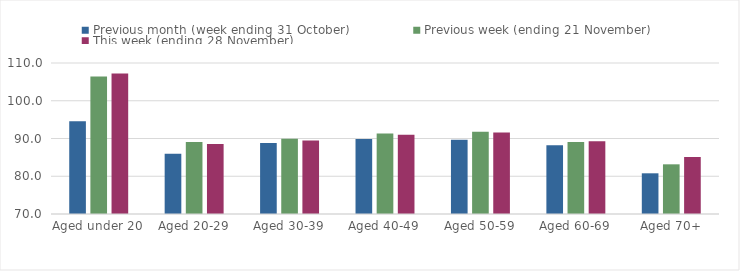
| Category | Previous month (week ending 31 October) | Previous week (ending 21 November) | This week (ending 28 November) |
|---|---|---|---|
| Aged under 20 | 94.59 | 106.4 | 107.25 |
| Aged 20-29 | 85.96 | 89.09 | 88.54 |
| Aged 30-39 | 88.78 | 89.94 | 89.48 |
| Aged 40-49 | 89.87 | 91.33 | 91.02 |
| Aged 50-59 | 89.66 | 91.77 | 91.58 |
| Aged 60-69 | 88.19 | 89.09 | 89.25 |
| Aged 70+ | 80.78 | 83.16 | 85.07 |